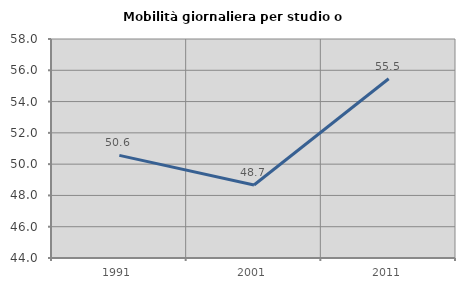
| Category | Mobilità giornaliera per studio o lavoro |
|---|---|
| 1991.0 | 50.562 |
| 2001.0 | 48.669 |
| 2011.0 | 55.462 |